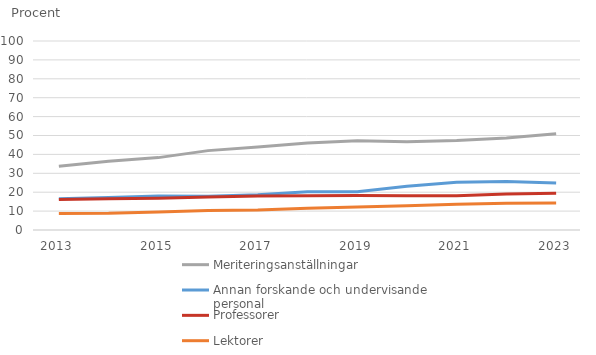
| Category | Meriteringsanställningar | Annan forskande och undervisande personal | Professorer | Lektorer |
|---|---|---|---|---|
| 2013.0 | 33.7 | 16.5 | 16.1 | 8.7 |
| 2014.0 | 36.4 | 17.2 | 16.5 | 8.8 |
| 2015.0 | 38.3 | 18 | 16.8 | 9.5 |
| 2016.0 | 42 | 17.9 | 17.4 | 10.3 |
| 2017.0 | 43.9 | 18.7 | 18 | 10.6 |
| 2018.0 | 46 | 20.2 | 18.1 | 11.5 |
| 2019.0 | 47.2 | 20.3 | 18.3 | 12.2 |
| 2020.0 | 46.7 | 23.1 | 18.1 | 12.8 |
| 2021.0 | 47.4 | 25.2 | 18.1 | 13.6 |
| 2022.0 | 48.7 | 25.6 | 19 | 14.1 |
| 2023.0 | 50.9 | 24.9 | 19.5 | 14.3 |